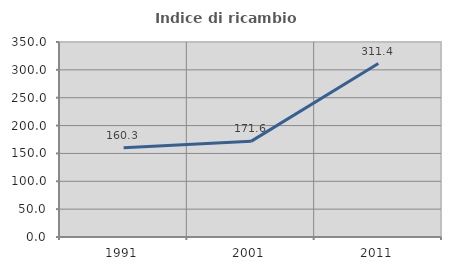
| Category | Indice di ricambio occupazionale  |
|---|---|
| 1991.0 | 160.317 |
| 2001.0 | 171.642 |
| 2011.0 | 311.364 |